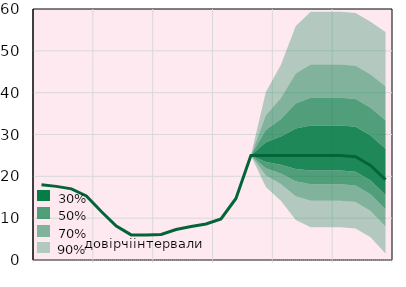
| Category | Облікова ставка, % |
|---|---|
|  | 18 |
|  | 17.6 |
|  | 17 |
| IV.19 | 15.3 |
|  | 11.6 |
|  | 8.1 |
|  | 6 |
| IV.20 | 6 |
|  | 6.1 |
|  | 7.3 |
|  | 8 |
| IV.21 | 8.6 |
|  | 9.8 |
|  | 14.7 |
|  | 25 |
| IV.22 | 25 |
|  | 25 |
|  | 25 |
|  | 25 |
| IV.23 | 25 |
|  | 25 |
|  | 24.7 |
|  | 22.6 |
| IV.24 | 19.2 |